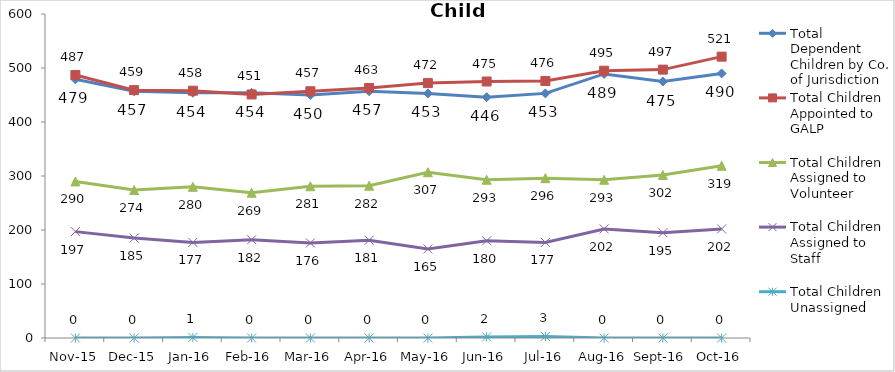
| Category | Total Dependent Children by Co. of Jurisdiction | Total Children Appointed to GALP | Total Children Assigned to Volunteer | Total Children Assigned to Staff | Total Children Unassigned |
|---|---|---|---|---|---|
| Nov-15 | 479 | 487 | 290 | 197 | 0 |
| Dec-15 | 457 | 459 | 274 | 185 | 0 |
| Jan-16 | 454 | 458 | 280 | 177 | 1 |
| Feb-16 | 454 | 451 | 269 | 182 | 0 |
| Mar-16 | 450 | 457 | 281 | 176 | 0 |
| Apr-16 | 457 | 463 | 282 | 181 | 0 |
| May-16 | 453 | 472 | 307 | 165 | 0 |
| Jun-16 | 446 | 475 | 293 | 180 | 2 |
| Jul-16 | 453 | 476 | 296 | 177 | 3 |
| Aug-16 | 489 | 495 | 293 | 202 | 0 |
| Sep-16 | 475 | 497 | 302 | 195 | 0 |
| Oct-16 | 490 | 521 | 319 | 202 | 0 |